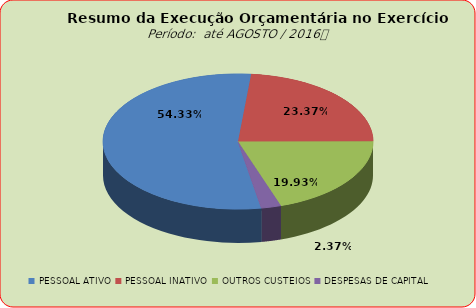
| Category | Series 0 |
|---|---|
| PESSOAL ATIVO | 89467128.6 |
| PESSOAL INATIVO | 38483874.04 |
| OUTROS CUSTEIOS | 32818229.4 |
| DESPESAS DE CAPITAL | 3894309.95 |